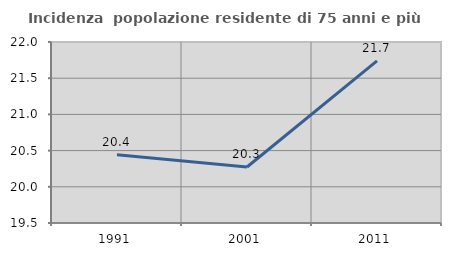
| Category | Incidenza  popolazione residente di 75 anni e più |
|---|---|
| 1991.0 | 20.443 |
| 2001.0 | 20.274 |
| 2011.0 | 21.739 |